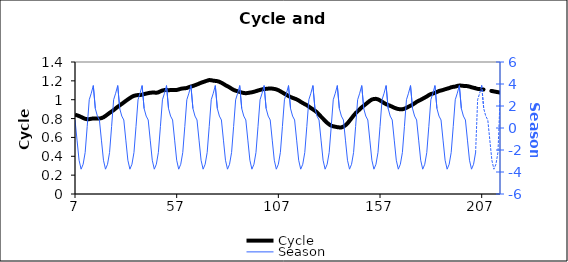
| Category | Cycle |
|---|---|
| 7.0 | 0.842 |
| 8.0 | 0.835 |
| 9.0 | 0.827 |
| 10.0 | 0.817 |
| 11.0 | 0.806 |
| 12.0 | 0.798 |
| 13.0 | 0.793 |
| 14.0 | 0.794 |
| 15.0 | 0.798 |
| 16.0 | 0.802 |
| 17.0 | 0.801 |
| 18.0 | 0.8 |
| 19.0 | 0.8 |
| 20.0 | 0.805 |
| 21.0 | 0.814 |
| 22.0 | 0.828 |
| 23.0 | 0.844 |
| 24.0 | 0.861 |
| 25.0 | 0.875 |
| 26.0 | 0.89 |
| 27.0 | 0.908 |
| 28.0 | 0.925 |
| 29.0 | 0.94 |
| 30.0 | 0.956 |
| 31.0 | 0.972 |
| 32.0 | 0.988 |
| 33.0 | 1.003 |
| 34.0 | 1.018 |
| 35.0 | 1.031 |
| 36.0 | 1.041 |
| 37.0 | 1.047 |
| 38.0 | 1.049 |
| 39.0 | 1.05 |
| 40.0 | 1.053 |
| 41.0 | 1.06 |
| 42.0 | 1.065 |
| 43.0 | 1.07 |
| 44.0 | 1.074 |
| 45.0 | 1.076 |
| 46.0 | 1.076 |
| 47.0 | 1.074 |
| 48.0 | 1.078 |
| 49.0 | 1.089 |
| 50.0 | 1.098 |
| 51.0 | 1.102 |
| 52.0 | 1.103 |
| 53.0 | 1.101 |
| 54.0 | 1.102 |
| 55.0 | 1.103 |
| 56.0 | 1.102 |
| 57.0 | 1.104 |
| 58.0 | 1.109 |
| 59.0 | 1.116 |
| 60.0 | 1.12 |
| 61.0 | 1.121 |
| 62.0 | 1.125 |
| 63.0 | 1.133 |
| 64.0 | 1.14 |
| 65.0 | 1.146 |
| 66.0 | 1.154 |
| 67.0 | 1.162 |
| 68.0 | 1.171 |
| 69.0 | 1.18 |
| 70.0 | 1.188 |
| 71.0 | 1.195 |
| 72.0 | 1.202 |
| 73.0 | 1.208 |
| 74.0 | 1.207 |
| 75.0 | 1.202 |
| 76.0 | 1.199 |
| 77.0 | 1.197 |
| 78.0 | 1.19 |
| 79.0 | 1.18 |
| 80.0 | 1.168 |
| 81.0 | 1.154 |
| 82.0 | 1.143 |
| 83.0 | 1.131 |
| 84.0 | 1.117 |
| 85.0 | 1.104 |
| 86.0 | 1.096 |
| 87.0 | 1.09 |
| 88.0 | 1.083 |
| 89.0 | 1.076 |
| 90.0 | 1.071 |
| 91.0 | 1.069 |
| 92.0 | 1.072 |
| 93.0 | 1.075 |
| 94.0 | 1.079 |
| 95.0 | 1.084 |
| 96.0 | 1.091 |
| 97.0 | 1.098 |
| 98.0 | 1.104 |
| 99.0 | 1.11 |
| 100.0 | 1.113 |
| 101.0 | 1.115 |
| 102.0 | 1.118 |
| 103.0 | 1.119 |
| 104.0 | 1.118 |
| 105.0 | 1.114 |
| 106.0 | 1.11 |
| 107.0 | 1.101 |
| 108.0 | 1.089 |
| 109.0 | 1.076 |
| 110.0 | 1.064 |
| 111.0 | 1.052 |
| 112.0 | 1.04 |
| 113.0 | 1.029 |
| 114.0 | 1.02 |
| 115.0 | 1.012 |
| 116.0 | 1.004 |
| 117.0 | 0.992 |
| 118.0 | 0.978 |
| 119.0 | 0.965 |
| 120.0 | 0.953 |
| 121.0 | 0.942 |
| 122.0 | 0.927 |
| 123.0 | 0.912 |
| 124.0 | 0.898 |
| 125.0 | 0.883 |
| 126.0 | 0.866 |
| 127.0 | 0.843 |
| 128.0 | 0.82 |
| 129.0 | 0.799 |
| 130.0 | 0.776 |
| 131.0 | 0.755 |
| 132.0 | 0.738 |
| 133.0 | 0.724 |
| 134.0 | 0.718 |
| 135.0 | 0.714 |
| 136.0 | 0.709 |
| 137.0 | 0.706 |
| 138.0 | 0.707 |
| 139.0 | 0.714 |
| 140.0 | 0.729 |
| 141.0 | 0.749 |
| 142.0 | 0.776 |
| 143.0 | 0.804 |
| 144.0 | 0.831 |
| 145.0 | 0.857 |
| 146.0 | 0.878 |
| 147.0 | 0.898 |
| 148.0 | 0.919 |
| 149.0 | 0.937 |
| 150.0 | 0.954 |
| 151.0 | 0.971 |
| 152.0 | 0.989 |
| 153.0 | 1.002 |
| 154.0 | 1.008 |
| 155.0 | 1.009 |
| 156.0 | 1.004 |
| 157.0 | 0.992 |
| 158.0 | 0.979 |
| 159.0 | 0.965 |
| 160.0 | 0.952 |
| 161.0 | 0.944 |
| 162.0 | 0.935 |
| 163.0 | 0.925 |
| 164.0 | 0.915 |
| 165.0 | 0.907 |
| 166.0 | 0.901 |
| 167.0 | 0.898 |
| 168.0 | 0.899 |
| 169.0 | 0.905 |
| 170.0 | 0.914 |
| 171.0 | 0.926 |
| 172.0 | 0.937 |
| 173.0 | 0.947 |
| 174.0 | 0.962 |
| 175.0 | 0.977 |
| 176.0 | 0.988 |
| 177.0 | 0.999 |
| 178.0 | 1.011 |
| 179.0 | 1.023 |
| 180.0 | 1.034 |
| 181.0 | 1.049 |
| 182.0 | 1.06 |
| 183.0 | 1.066 |
| 184.0 | 1.072 |
| 185.0 | 1.082 |
| 186.0 | 1.092 |
| 187.0 | 1.098 |
| 188.0 | 1.104 |
| 189.0 | 1.111 |
| 190.0 | 1.117 |
| 191.0 | 1.123 |
| 192.0 | 1.132 |
| 193.0 | 1.137 |
| 194.0 | 1.139 |
| 195.0 | 1.147 |
| 196.0 | 1.15 |
| 197.0 | 1.149 |
| 198.0 | 1.147 |
| 199.0 | 1.146 |
| 200.0 | 1.144 |
| 201.0 | 1.139 |
| 202.0 | 1.132 |
| 203.0 | 1.127 |
| 204.0 | 1.121 |
| 205.0 | 1.115 |
| 206.0 | 1.113 |
| 207.0 | 1.11 |
| 208.0 | 1.108 |
| 209.0 | 1.104 |
| 210.0 | 1.1 |
| 211.0 | 1.096 |
| 212.0 | 1.092 |
| 213.0 | 1.088 |
| 214.0 | 1.084 |
| 215.0 | 1.08 |
| 216.0 | 1.076 |